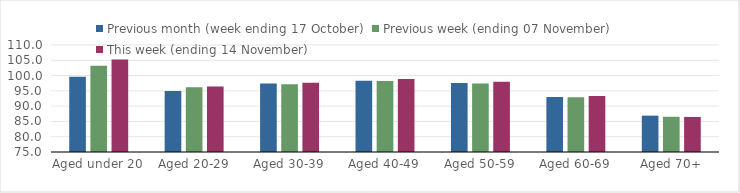
| Category | Previous month (week ending 17 October) | Previous week (ending 07 November) | This week (ending 14 November) |
|---|---|---|---|
| Aged under 20 | 99.65 | 103.2 | 105.27 |
| Aged 20-29 | 94.96 | 96.18 | 96.44 |
| Aged 30-39 | 97.43 | 97.18 | 97.63 |
| Aged 40-49 | 98.29 | 98.24 | 98.86 |
| Aged 50-59 | 97.56 | 97.38 | 97.97 |
| Aged 60-69 | 93 | 92.88 | 93.3 |
| Aged 70+ | 86.89 | 86.52 | 86.47 |